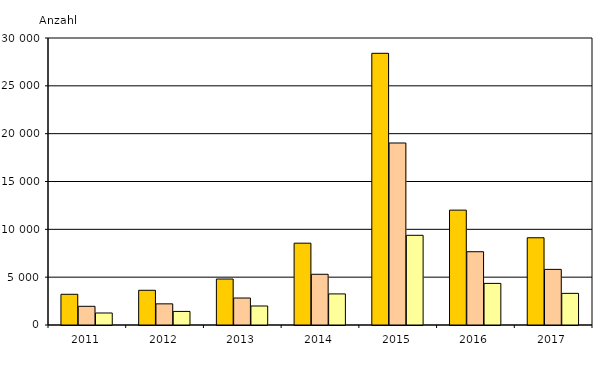
| Category | Insgesamt | männlich | weiblich |
|---|---|---|---|
| 2011.0 | 3210 | 1955 | 1255 |
| 2012.0 | 3629 | 2211 | 1418 |
| 2013.0 | 4807 | 2820 | 1987 |
| 2014.0 | 8552 | 5302 | 3250 |
| 2015.0 | 28401 | 19025 | 9376 |
| 2016.0 | 12007 | 7659 | 4348 |
| 2017.0 | 9120 | 5814 | 3306 |